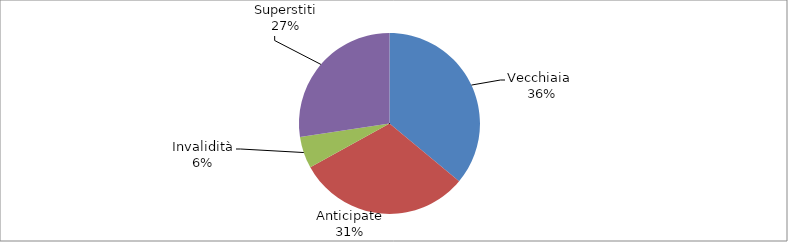
| Category | Series 0 |
|---|---|
| Vecchiaia  | 20390 |
| Anticipate | 17494 |
| Invalidità | 3207 |
| Superstiti | 15481 |